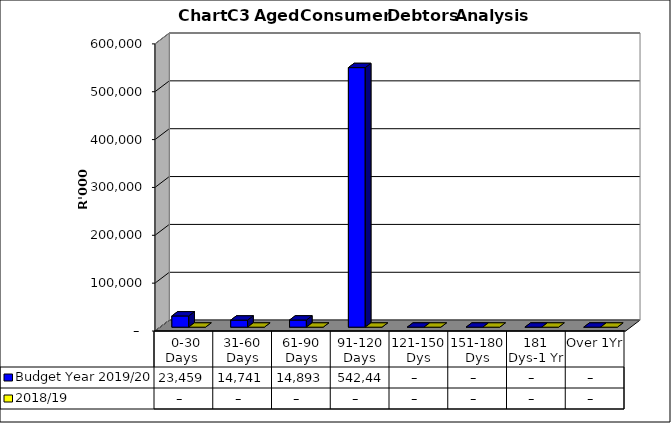
| Category | Budget Year 2019/20 | 2018/19 |
|---|---|---|
|  0-30 Days  | 23459018.34 | 0 |
| 31-60 Days | 14741345.06 | 0 |
| 61-90 Days | 14893140.7 | 0 |
| 91-120 Days | 542442425.89 | 0 |
| 121-150 Dys | 0 | 0 |
| 151-180 Dys | 0 | 0 |
| 181 Dys-1 Yr | 0 | 0 |
| Over 1Yr | 0 | 0 |